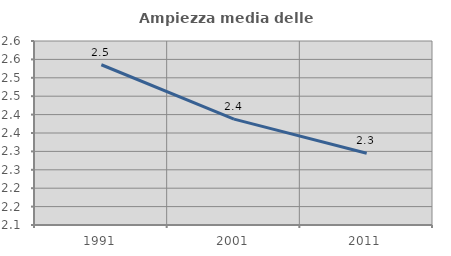
| Category | Ampiezza media delle famiglie |
|---|---|
| 1991.0 | 2.535 |
| 2001.0 | 2.388 |
| 2011.0 | 2.295 |